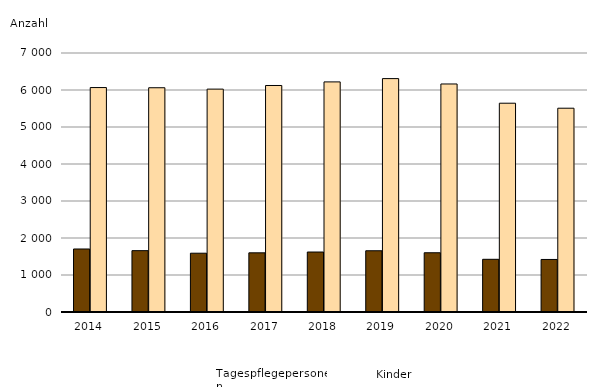
| Category | Tätige Personen | Kinder |
|---|---|---|
| 2014.0 | 1703 | 6066 |
| 2015.0 | 1658 | 6061 |
| 2016.0 | 1589 | 6024 |
| 2017.0 | 1599 | 6122 |
| 2018.0 | 1621 | 6219 |
| 2019.0 | 1655 | 6308 |
| 2020.0 | 1601 | 6163 |
| 2021.0 | 1424 | 5643 |
| 2022.0 | 1420 | 5508 |